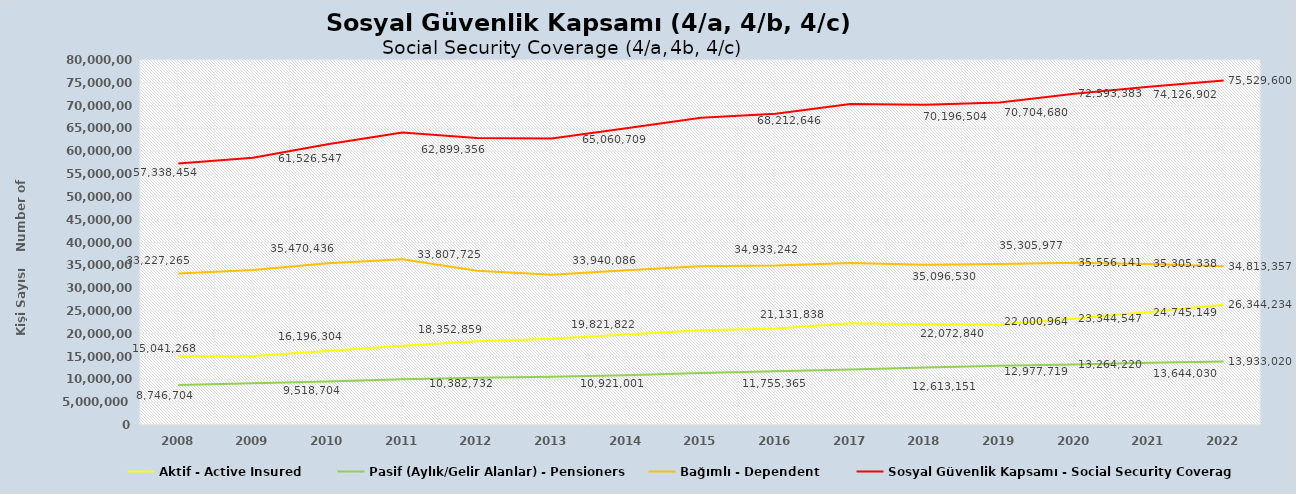
| Category | Aktif - Active Insured | Pasif (Aylık/Gelir Alanlar) - Pensioners | Bağımlı - Dependent | Sosyal Güvenlik Kapsamı - Social Security Coverage |
|---|---|---|---|---|
| 2008.0 | 15041268 | 8746704 | 33227265 | 57338454 |
| 2009.0 | 15096728 | 9173780 | 33989891 | 58591604 |
| 2010.0 | 16196304 | 9518704 | 35470436 | 61526547 |
| 2011.0 | 17374631 | 10015071 | 36348316 | 64088909 |
| 2012.0 | 18352859 | 10382732 | 33807725 | 62899356 |
| 2013.0 | 18886989 | 10595966 | 32939205 | 62789365 |
| 2014.0 | 19821822 | 10921001 | 33940086 | 65060709 |
| 2015.0 | 20773227 | 11384263 | 34786174 | 67330236 |
| 2016.0 | 21131838 | 11755365 | 34933242 | 68212646 |
| 2017.0 | 22280463 | 12154140 | 35522020 | 70363479 |
| 2018.0 | 22072840 | 12613151 | 35096530 | 70196504 |
| 2019.0 | 22000964 | 12977719 | 35305977 | 70704680 |
| 2020.0 | 23344547 | 13264220 | 35556141 | 72593383 |
| 2021.0 | 24745149 | 13644030 | 35305338 | 74126902 |
| 2022.0 | 26344234 | 13933020 | 34813357 | 75529600 |